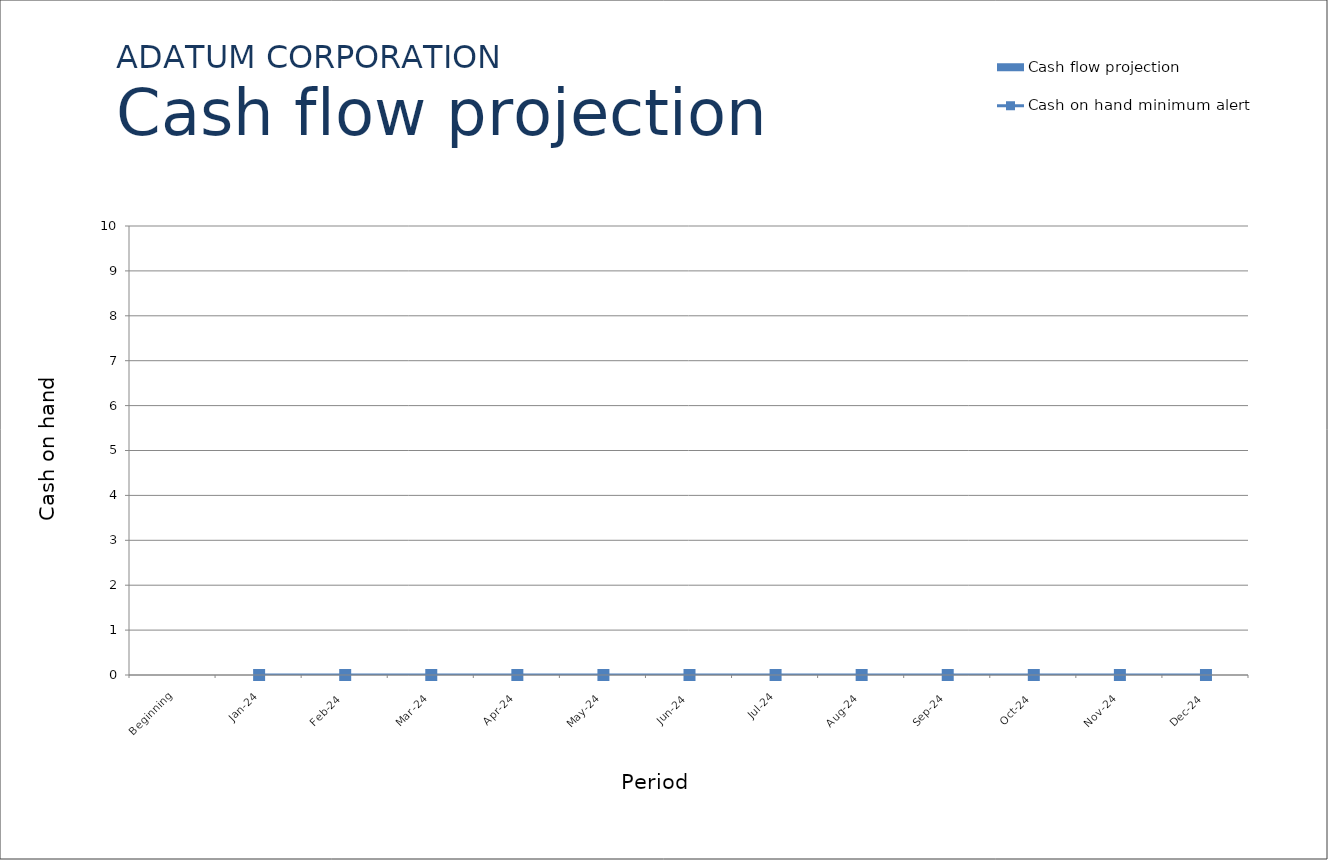
| Category | Cash flow projection |
|---|---|
| Beginning | 0 |
| Jan-24 | 0 |
| Feb-24 | 0 |
| Mar-24 | 0 |
| Apr-24 | 0 |
| May-24 | 0 |
| Jun-24 | 0 |
| Jul-24 | 0 |
| Aug-24 | 0 |
| Sep-24 | 0 |
| Oct-24 | 0 |
| Nov-24 | 0 |
| Dec-24 | 0 |